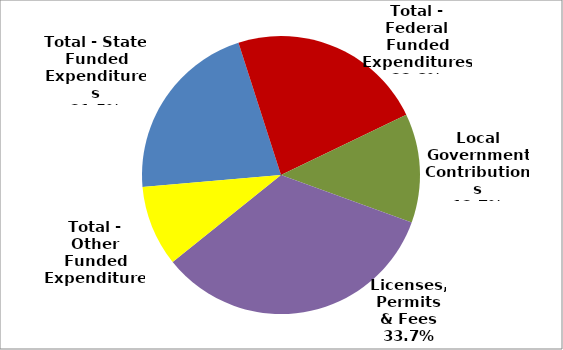
| Category | Series 0 |
|---|---|
| Total - State Funded Expenditures | 2209498 |
| Total - Federal Funded Expenditures | 2350854 |
| Local Government Contributions | 1305848 |
| Licenses, Permits & Fees | 3472018 |
| Total - Other Funded Expenditures | 966929 |